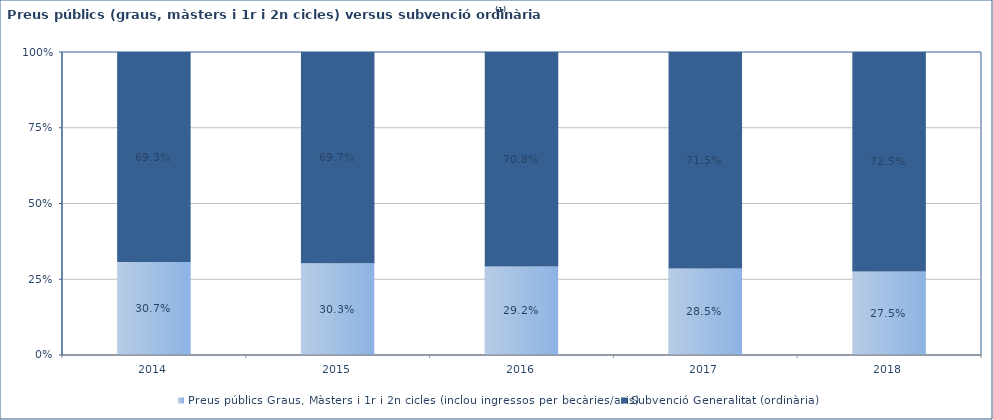
| Category | Preus públics Graus, Màsters i 1r i 2n cicles (inclou ingressos per becàries/aris) | Subvenció Generalitat (ordinària) |
|---|---|---|
| 2014.0 | 0.307 | 0.693 |
| 2015.0 | 0.303 | 0.697 |
| 2016.0 | 0.292 | 0.708 |
| 2017.0 | 0.285 | 0.715 |
| 2018.0 | 0.275 | 0.725 |